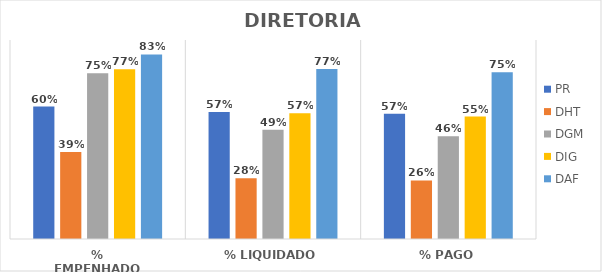
| Category | PR | DHT | DGM | DIG | DAF |
|---|---|---|---|---|---|
| % EMPENHADO | 0.599 | 0.393 | 0.75 | 0.767 | 0.834 |
| % LIQUIDADO | 0.574 | 0.275 | 0.494 | 0.569 | 0.768 |
| % PAGO | 0.567 | 0.265 | 0.464 | 0.554 | 0.754 |